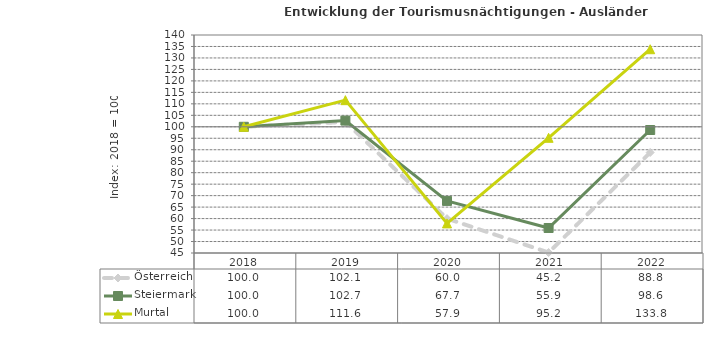
| Category | Österreich | Steiermark | Murtal |
|---|---|---|---|
| 2022.0 | 88.8 | 98.6 | 133.8 |
| 2021.0 | 45.2 | 55.9 | 95.2 |
| 2020.0 | 60 | 67.7 | 57.9 |
| 2019.0 | 102.1 | 102.7 | 111.6 |
| 2018.0 | 100 | 100 | 100 |